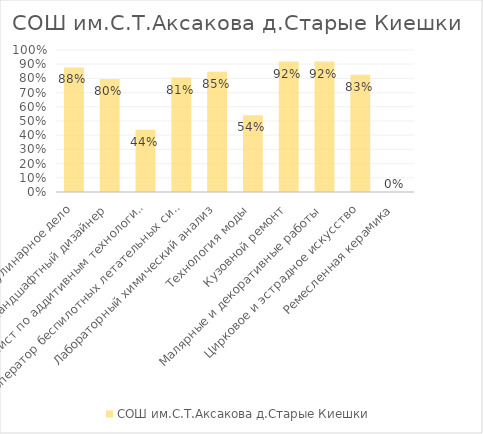
| Category | СОШ им.С.Т.Аксакова д.Старые Киешки |
|---|---|
| Кулинарное дело | 0.878 |
| Ландшафтный дизайнер | 0.796 |
| Специалист по аддитивным технологиям | 0.439 |
| Оператор беспилотных летательных систем | 0.806 |
| Лабораторный химический анализ | 0.847 |
| Технология моды | 0.541 |
| Кузовной ремонт | 0.918 |
| Малярные и декоративные работы | 0.918 |
| Цирковое и эстрадное искусство | 0.827 |
| Ремесленная керамика | 0 |